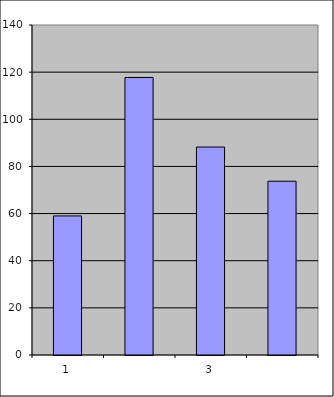
| Category | Series 0 |
|---|---|
| 0 | 59 |
| 1 | 117.741 |
| 2 | 88.23 |
| 3 | 73.729 |